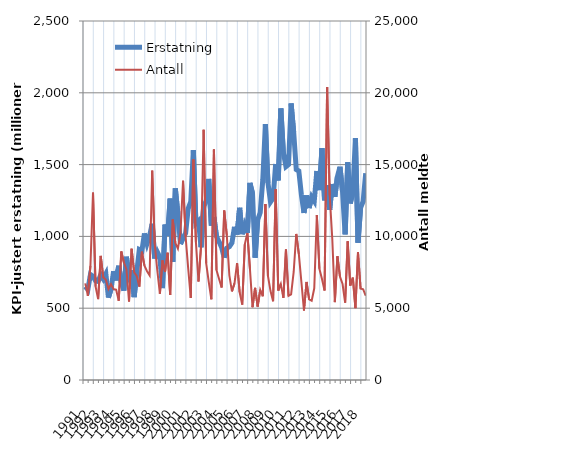
| Category | Erstatning |
|---|---|
| 1991.0 | 650.648 |
| nan | 629.43 |
| nan | 734.421 |
| nan | 721.938 |
| 1992.0 | 690.768 |
| nan | 686.357 |
| nan | 732.841 |
| nan | 703.455 |
| 1993.0 | 738.657 |
| nan | 573.657 |
| nan | 632.921 |
| nan | 757.464 |
| 1994.0 | 693.558 |
| nan | 795.624 |
| nan | 681.909 |
| nan | 622.598 |
| 1995.0 | 858.103 |
| nan | 725.295 |
| nan | 765.293 |
| nan | 577.138 |
| 1996.0 | 751.945 |
| nan | 908.415 |
| nan | 899.355 |
| nan | 1020.479 |
| 1997.0 | 949.161 |
| nan | 1003.74 |
| nan | 1088.191 |
| nan | 846 |
| 1998.0 | 891.248 |
| nan | 854.067 |
| nan | 640.093 |
| nan | 1082.595 |
| 1999.0 | 1003.069 |
| nan | 1263.121 |
| nan | 822.903 |
| nan | 1334.104 |
| 2000.0 | 1156.953 |
| nan | 946.831 |
| nan | 989.887 |
| nan | 1021.591 |
| 2001.0 | 1194.144 |
| nan | 1243.018 |
| nan | 1600.525 |
| nan | 1090.774 |
| 2002.0 | 1107.878 |
| nan | 924.647 |
| nan | 1206.522 |
| nan | 1247.951 |
| 2003.0 | 1400.268 |
| nan | 1074.864 |
| nan | 1134.634 |
| nan | 999.249 |
| 2004.0 | 963.726 |
| nan | 921.914 |
| nan | 852.553 |
| nan | 918.486 |
| 2005.0 | 928.439 |
| nan | 955.172 |
| nan | 1067.054 |
| nan | 1012.587 |
| 2006.0 | 1199.028 |
| nan | 1015.548 |
| nan | 1076.989 |
| nan | 1024.518 |
| 2007.0 | 1371.989 |
| nan | 1299.703 |
| nan | 851.519 |
| nan | 1113.965 |
| 2008.0 | 1166.754 |
| nan | 1395.909 |
| nan | 1782.351 |
| nan | 1373.023 |
| 2009.0 | 1239.722 |
| nan | 1265.696 |
| nan | 1504.367 |
| nan | 1389.958 |
| 2010.0 | 1890.587 |
| nan | 1582.148 |
| nan | 1485.47 |
| nan | 1499.799 |
| 2011.0 | 1925.715 |
| nan | 1727.709 |
| nan | 1466.19 |
| nan | 1455.486 |
| 2012.0 | 1289.19 |
| nan | 1163.089 |
| nan | 1285.325 |
| nan | 1197.586 |
| 2013.0 | 1274.225 |
| nan | 1245.98 |
| nan | 1455.531 |
| nan | 1322.905 |
| 2014.0 | 1613.943 |
| nan | 1251.164 |
| nan | 1357.353 |
| nan | 1184.708 |
| 2015.0 | 1364.912 |
| nan | 1275.895 |
| nan | 1416.944 |
| nan | 1484.685 |
| 2016.0 | 1310.689 |
| nan | 1014.193 |
| nan | 1516.078 |
| nan | 1229.613 |
| 2017.0 | 1307.073 |
| nan | 1684.101 |
| nan | 955.943 |
| nan | 1198.504 |
| 2018.0 | 1244.297 |
| nan | 1440.731 |